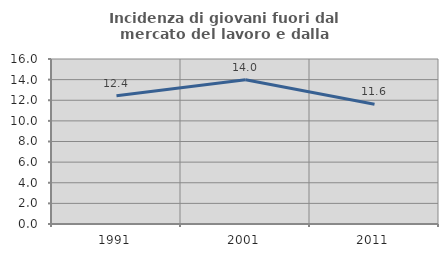
| Category | Incidenza di giovani fuori dal mercato del lavoro e dalla formazione  |
|---|---|
| 1991.0 | 12.44 |
| 2001.0 | 13.992 |
| 2011.0 | 11.607 |